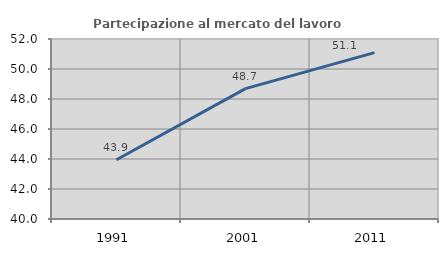
| Category | Partecipazione al mercato del lavoro  femminile |
|---|---|
| 1991.0 | 43.95 |
| 2001.0 | 48.69 |
| 2011.0 | 51.092 |